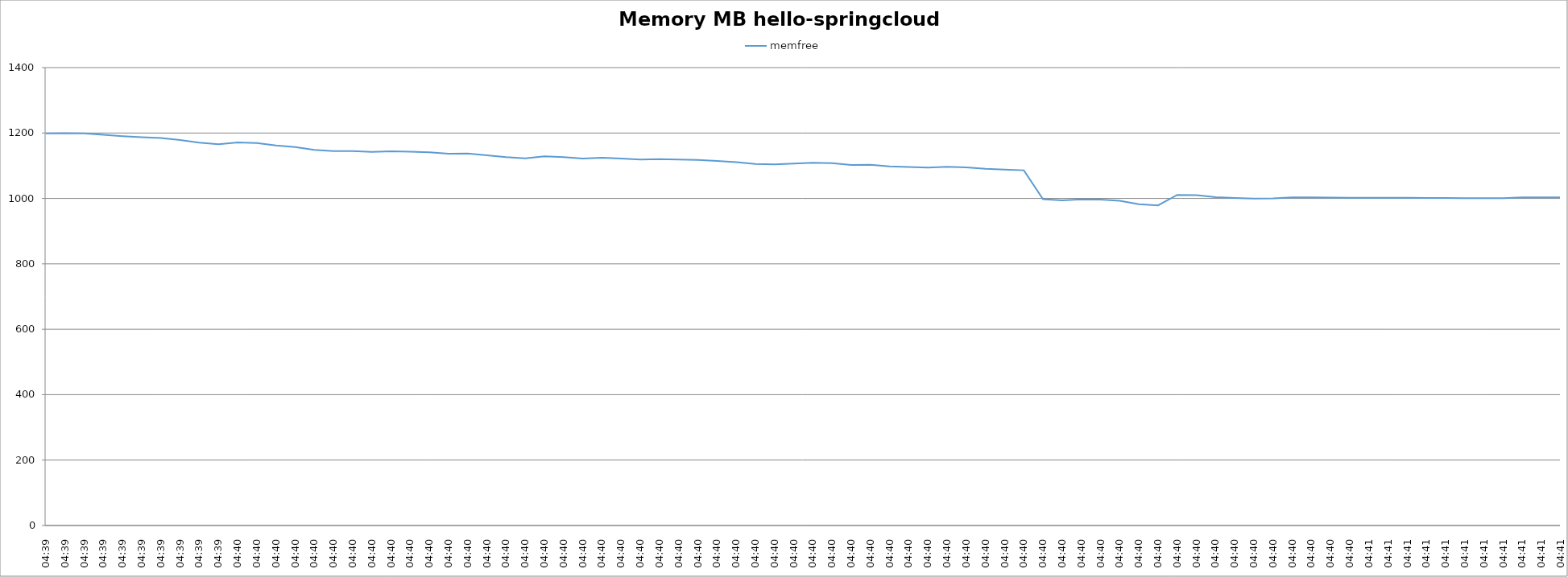
| Category | memfree |
|---|---|
| 04:39 | 1198.8 |
| 04:39 | 1199.4 |
| 04:39 | 1198.7 |
| 04:39 | 1194.4 |
| 04:39 | 1190.3 |
| 04:39 | 1187.2 |
| 04:39 | 1184.6 |
| 04:39 | 1178.5 |
| 04:39 | 1170.8 |
| 04:39 | 1165.5 |
| 04:40 | 1171.2 |
| 04:40 | 1169.2 |
| 04:40 | 1161.9 |
| 04:40 | 1156.9 |
| 04:40 | 1148.5 |
| 04:40 | 1144.6 |
| 04:40 | 1145 |
| 04:40 | 1142.2 |
| 04:40 | 1144.4 |
| 04:40 | 1142.6 |
| 04:40 | 1141.3 |
| 04:40 | 1136.5 |
| 04:40 | 1137.6 |
| 04:40 | 1131.9 |
| 04:40 | 1126.3 |
| 04:40 | 1122.8 |
| 04:40 | 1129 |
| 04:40 | 1126 |
| 04:40 | 1122.1 |
| 04:40 | 1124.7 |
| 04:40 | 1121.7 |
| 04:40 | 1118.7 |
| 04:40 | 1120 |
| 04:40 | 1119.1 |
| 04:40 | 1117.7 |
| 04:40 | 1114.5 |
| 04:40 | 1111.1 |
| 04:40 | 1105.1 |
| 04:40 | 1104.1 |
| 04:40 | 1106.3 |
| 04:40 | 1108.8 |
| 04:40 | 1107.8 |
| 04:40 | 1102.4 |
| 04:40 | 1102.6 |
| 04:40 | 1098.1 |
| 04:40 | 1096.1 |
| 04:40 | 1094.3 |
| 04:40 | 1096.8 |
| 04:40 | 1095 |
| 04:40 | 1090.8 |
| 04:40 | 1088.2 |
| 04:40 | 1086 |
| 04:40 | 997.6 |
| 04:40 | 994.2 |
| 04:40 | 996.9 |
| 04:40 | 996.7 |
| 04:40 | 992.7 |
| 04:40 | 982.2 |
| 04:40 | 978.9 |
| 04:40 | 1010.9 |
| 04:40 | 1010 |
| 04:40 | 1003.9 |
| 04:40 | 1001.2 |
| 04:40 | 999.4 |
| 04:40 | 1000.2 |
| 04:40 | 1003 |
| 04:40 | 1003.2 |
| 04:40 | 1002.5 |
| 04:40 | 1002 |
| 04:41 | 1002 |
| 04:41 | 1002 |
| 04:41 | 1001.9 |
| 04:41 | 1001.3 |
| 04:41 | 1001.3 |
| 04:41 | 1001 |
| 04:41 | 1000.9 |
| 04:41 | 1000.9 |
| 04:41 | 1003.3 |
| 04:41 | 1003.4 |
| 04:41 | 1003.4 |